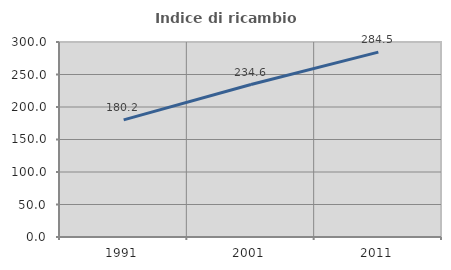
| Category | Indice di ricambio occupazionale  |
|---|---|
| 1991.0 | 180.237 |
| 2001.0 | 234.561 |
| 2011.0 | 284.483 |